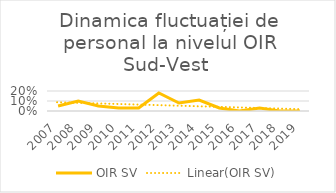
| Category | OIR SV |
|---|---|
| 2007.0 | 0.05 |
| 2008.0 | 0.1 |
| 2009.0 | 0.05 |
| 2010.0 | 0.03 |
| 2011.0 | 0.03 |
| 2012.0 | 0.18 |
| 2013.0 | 0.08 |
| 2014.0 | 0.11 |
| 2015.0 | 0.03 |
| 2016.0 | 0 |
| 2017.0 | 0.03 |
| 2018.0 | 0 |
| 2019.0 | 0 |